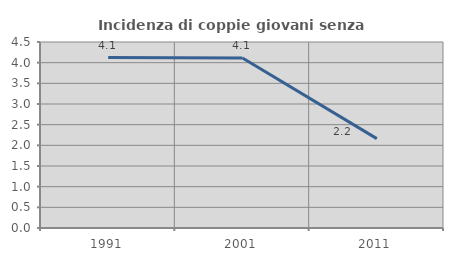
| Category | Incidenza di coppie giovani senza figli |
|---|---|
| 1991.0 | 4.125 |
| 2001.0 | 4.112 |
| 2011.0 | 2.163 |